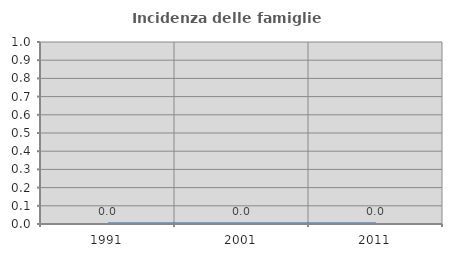
| Category | Incidenza delle famiglie numerose |
|---|---|
| 1991.0 | 0 |
| 2001.0 | 0 |
| 2011.0 | 0 |